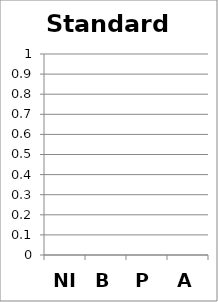
| Category | Standard 5 |
|---|---|
| NI | 0 |
| B | 0 |
| P | 0 |
| A | 0 |